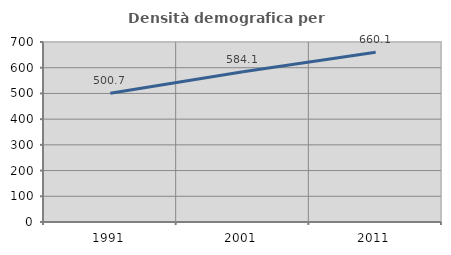
| Category | Densità demografica |
|---|---|
| 1991.0 | 500.702 |
| 2001.0 | 584.058 |
| 2011.0 | 660.149 |